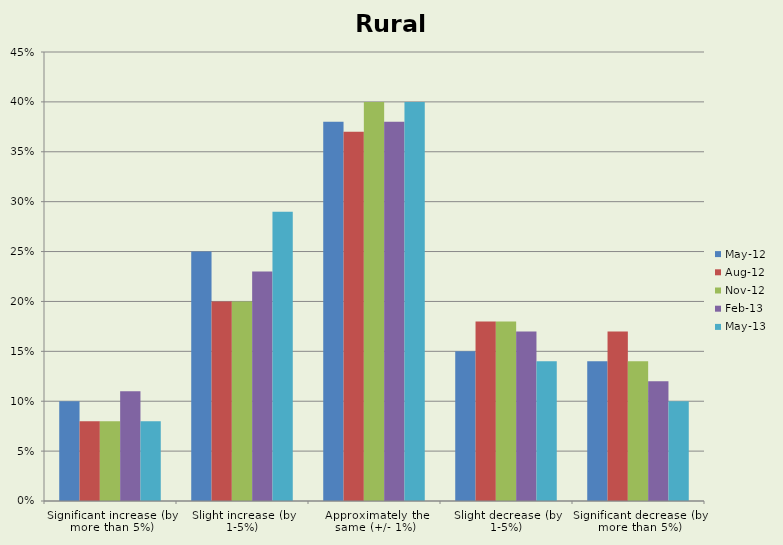
| Category | May-12 | Aug-12 | Nov-12 | Feb-13 | May-13 |
|---|---|---|---|---|---|
| Significant increase (by more than 5%) | 0.1 | 0.08 | 0.08 | 0.11 | 0.08 |
| Slight increase (by 1-5%) | 0.25 | 0.2 | 0.2 | 0.23 | 0.29 |
| Approximately the same (+/- 1%) | 0.38 | 0.37 | 0.4 | 0.38 | 0.4 |
| Slight decrease (by 1-5%) | 0.15 | 0.18 | 0.18 | 0.17 | 0.14 |
| Significant decrease (by more than 5%) | 0.14 | 0.17 | 0.14 | 0.12 | 0.1 |